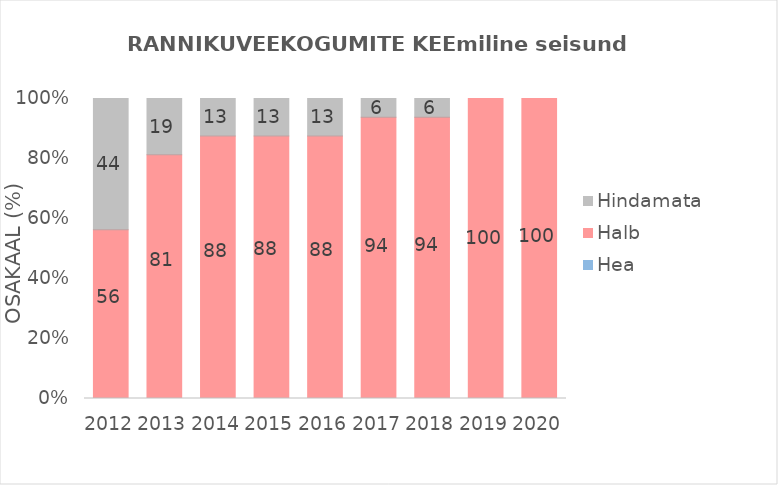
| Category | Hea  | Halb | Hindamata |
|---|---|---|---|
| 2012.0 | 0 | 56.25 | 43.75 |
| 2013.0 | 0 | 81.25 | 18.75 |
| 2014.0 | 0 | 87.5 | 12.5 |
| 2015.0 | 0 | 87.5 | 12.5 |
| 2016.0 | 0 | 87.5 | 12.5 |
| 2017.0 | 0 | 93.75 | 6.25 |
| 2018.0 | 0 | 93.75 | 6.25 |
| 2019.0 | 0 | 100 | 0 |
| 2020.0 | 0 | 100 | 0 |